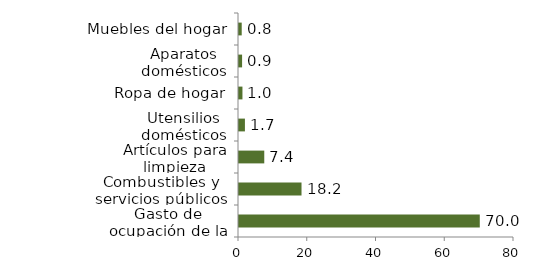
| Category | Vivienda |
|---|---|
| Gasto de ocupación de la vivienda | 70.045 |
| Combustibles y servicios públicos | 18.187 |
| Artículos para limpieza | 7.351 |
| Utensilios domésticos | 1.724 |
| Ropa de hogar | 1.004 |
| Aparatos domésticos | 0.898 |
| Muebles del hogar | 0.792 |